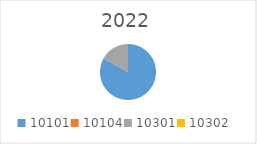
| Category | Series 0 |
|---|---|
| 10101.0 | 5850833.34 |
| 10104.0 | 0 |
| 10301.0 | 1192307.95 |
| 10302.0 | 0 |